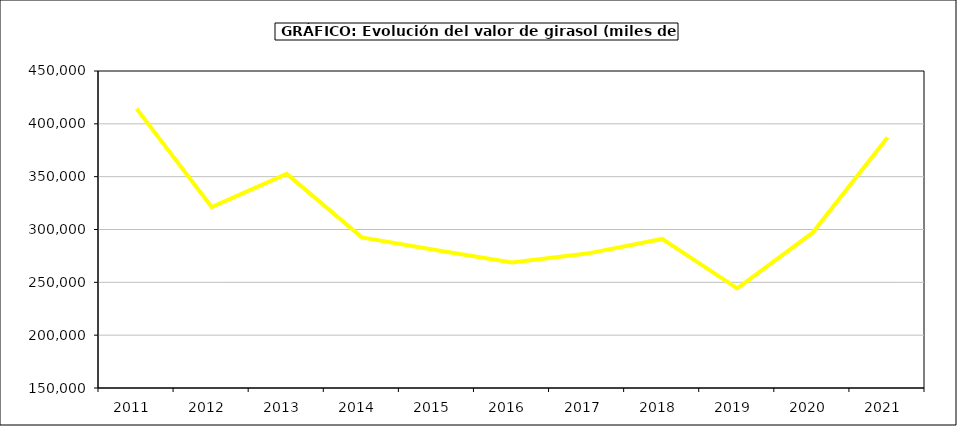
| Category | Valor |
|---|---|
| 2011.0 | 414373.997 |
| 2012.0 | 321265.307 |
| 2013.0 | 352632.719 |
| 2014.0 | 292566.702 |
| 2015.0 | 280295 |
| 2016.0 | 268873 |
| 2017.0 | 277184.982 |
| 2018.0 | 291090.98 |
| 2019.0 | 244284.556 |
| 2020.0 | 296719.584 |
| 2021.0 | 387065.454 |